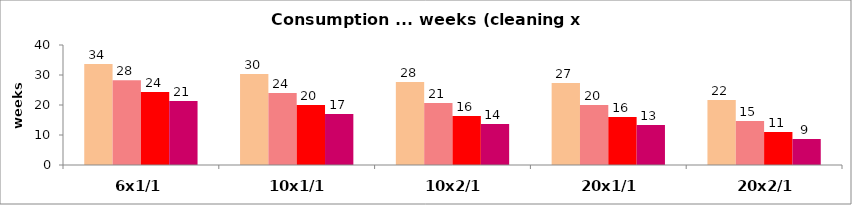
| Category | 0 Verfügbarkeit in Wochen bei x mal Reinigen/Woche |
|---|---|
| 6x1/1 | 21.34 |
| 10x1/1 | 17.007 |
| 10x2/1 | 13.661 |
| 20x1/1 | 13.333 |
| 20x2/1 | 8.667 |